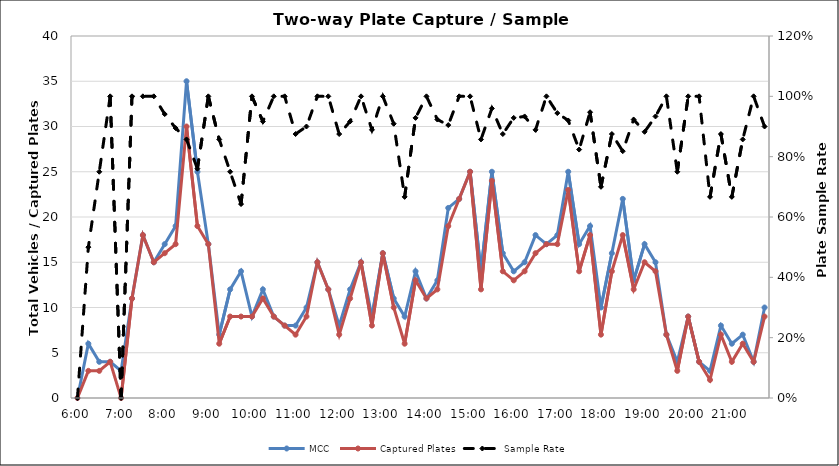
| Category | MCC | Captured Plates |
|---|---|---|
| 0.25 | 0 | 0 |
| 0.260416666666667 | 6 | 3 |
| 0.270833333333333 | 4 | 3 |
| 0.28125 | 4 | 4 |
| 0.291666666666667 | 3 | 0 |
| 0.302083333333333 | 11 | 11 |
| 0.3125 | 18 | 18 |
| 0.322916666666667 | 15 | 15 |
| 0.333333333333333 | 17 | 16 |
| 0.34375 | 19 | 17 |
| 0.354166666666667 | 35 | 30 |
| 0.364583333333333 | 25 | 19 |
| 0.375 | 17 | 17 |
| 0.385416666666667 | 7 | 6 |
| 0.395833333333333 | 12 | 9 |
| 0.40625 | 14 | 9 |
| 0.416666666666667 | 9 | 9 |
| 0.427083333333333 | 12 | 11 |
| 0.4375 | 9 | 9 |
| 0.447916666666667 | 8 | 8 |
| 0.458333333333333 | 8 | 7 |
| 0.46875 | 10 | 9 |
| 0.479166666666667 | 15 | 15 |
| 0.489583333333333 | 12 | 12 |
| 0.5 | 8 | 7 |
| 0.510416666666667 | 12 | 11 |
| 0.520833333333333 | 15 | 15 |
| 0.53125 | 9 | 8 |
| 0.541666666666667 | 16 | 16 |
| 0.552083333333333 | 11 | 10 |
| 0.5625 | 9 | 6 |
| 0.572916666666667 | 14 | 13 |
| 0.583333333333333 | 11 | 11 |
| 0.59375 | 13 | 12 |
| 0.604166666666667 | 21 | 19 |
| 0.614583333333333 | 22 | 22 |
| 0.625 | 25 | 25 |
| 0.635416666666667 | 14 | 12 |
| 0.645833333333333 | 25 | 24 |
| 0.65625 | 16 | 14 |
| 0.666666666666667 | 14 | 13 |
| 0.677083333333333 | 15 | 14 |
| 0.6875 | 18 | 16 |
| 0.697916666666667 | 17 | 17 |
| 0.708333333333333 | 18 | 17 |
| 0.71875 | 25 | 23 |
| 0.729166666666667 | 17 | 14 |
| 0.739583333333333 | 19 | 18 |
| 0.75 | 10 | 7 |
| 0.760416666666667 | 16 | 14 |
| 0.770833333333333 | 22 | 18 |
| 0.78125 | 13 | 12 |
| 0.791666666666667 | 17 | 15 |
| 0.802083333333333 | 15 | 14 |
| 0.8125 | 7 | 7 |
| 0.822916666666667 | 4 | 3 |
| 0.833333333333333 | 9 | 9 |
| 0.84375 | 4 | 4 |
| 0.854166666666667 | 3 | 2 |
| 0.864583333333333 | 8 | 7 |
| 0.875 | 6 | 4 |
| 0.885416666666667 | 7 | 6 |
| 0.895833333333333 | 4 | 4 |
| 0.90625 | 10 | 9 |